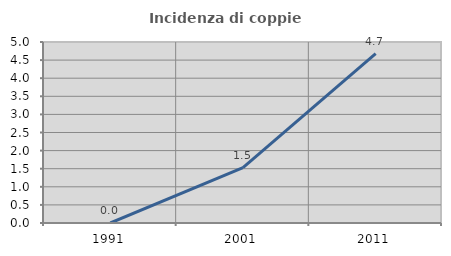
| Category | Incidenza di coppie miste |
|---|---|
| 1991.0 | 0 |
| 2001.0 | 1.533 |
| 2011.0 | 4.681 |